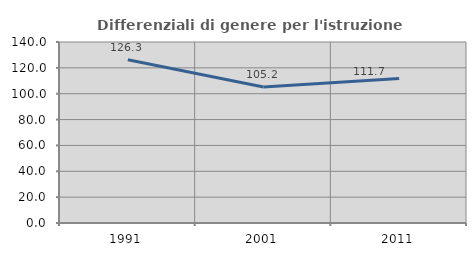
| Category | Differenziali di genere per l'istruzione superiore |
|---|---|
| 1991.0 | 126.276 |
| 2001.0 | 105.21 |
| 2011.0 | 111.693 |